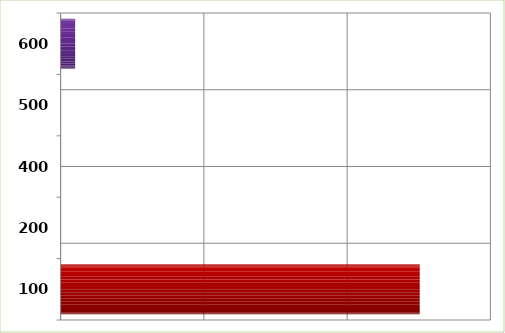
| Category | Series 0 |
|---|---|
| 100.0 | 5013328 |
| 200.0 | 0 |
| 400.0 | 0 |
| 500.0 | 0 |
| 600.0 | 203000 |